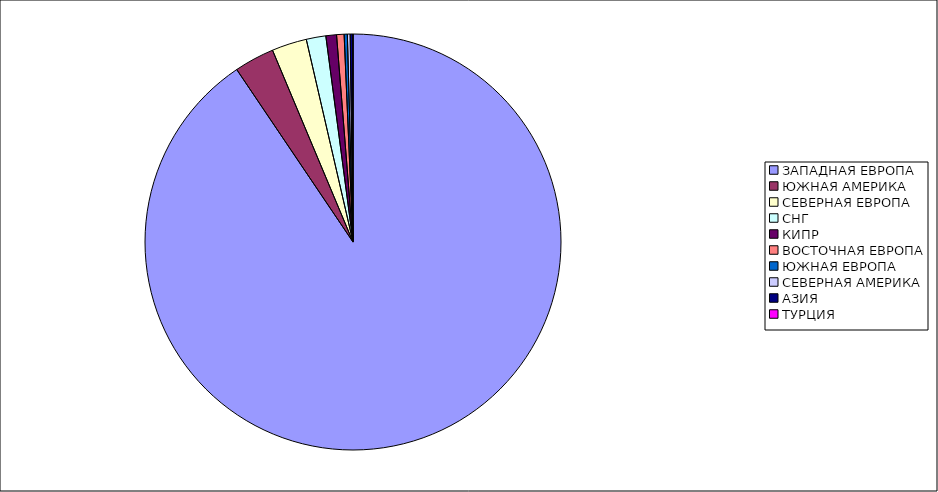
| Category | Оборот |
|---|---|
| ЗАПАДНАЯ ЕВРОПА | 0.906 |
| ЮЖНАЯ АМЕРИКА | 0.031 |
| СЕВЕРНАЯ ЕВРОПА | 0.027 |
| СНГ | 0.015 |
| КИПР | 0.008 |
| ВОСТОЧНАЯ ЕВРОПА | 0.006 |
| ЮЖНАЯ ЕВРОПА | 0.002 |
| СЕВЕРНАЯ АМЕРИКА | 0.002 |
| АЗИЯ | 0.002 |
| ТУРЦИЯ | 0 |